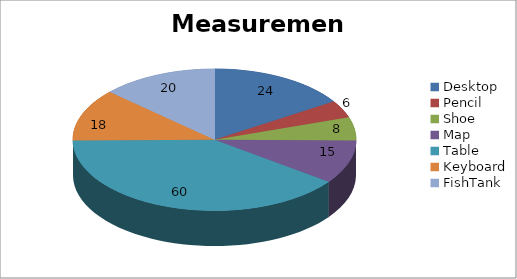
| Category | Size in Inches |
|---|---|
| Desktop | 24 |
| Pencil | 6 |
| Shoe | 8 |
| Map | 15 |
| Table | 60 |
| Keyboard | 18 |
| FishTank | 20 |